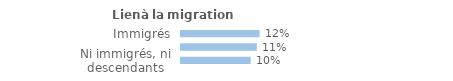
| Category | Series 0 |
|---|---|
| Immigrés | 0.117 |
| Descendants d'immigré(s) | 0.113 |
| Ni immigrés, ni descendants | 0.104 |